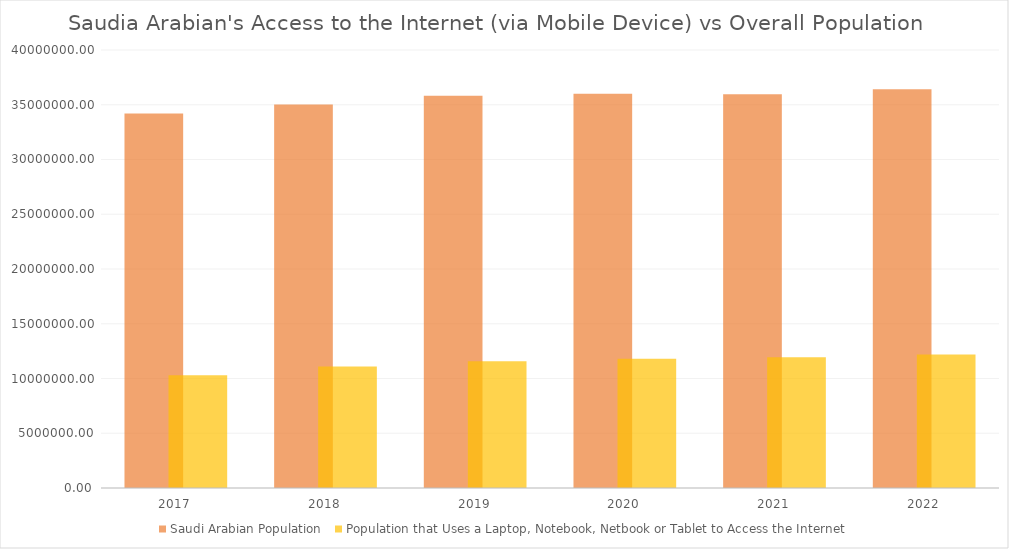
| Category | Saudi Arabian Population  | Population that Uses a Laptop, Notebook, Netbook or Tablet to Access the Internet |
|---|---|---|
| 2017.0 | 34193000 | 10292093 |
| 2018.0 | 35018000 | 11100706 |
| 2019.0 | 35827000 | 11572121 |
| 2020.0 | 35997000 | 11807016 |
| 2021.0 | 35950000 | 11935400 |
| 2022.0 | 36409000 | 12197015 |